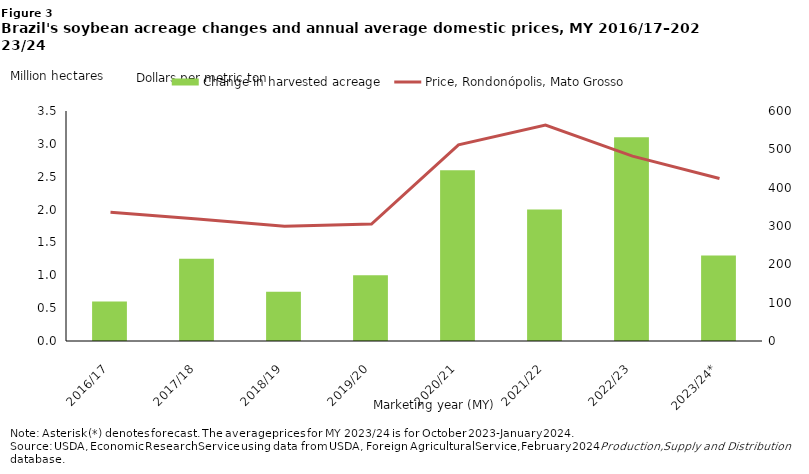
| Category | Change in harvested acreage |
|---|---|
| 2016/17 | 0.6 |
| 2017/18 | 1.25 |
| 2018/19 | 0.75 |
| 2019/20 | 1 |
| 2020/21 | 2.6 |
| 2021/22 | 2 |
| 2022/23 | 3.1 |
| 2023/24* | 1.3 |